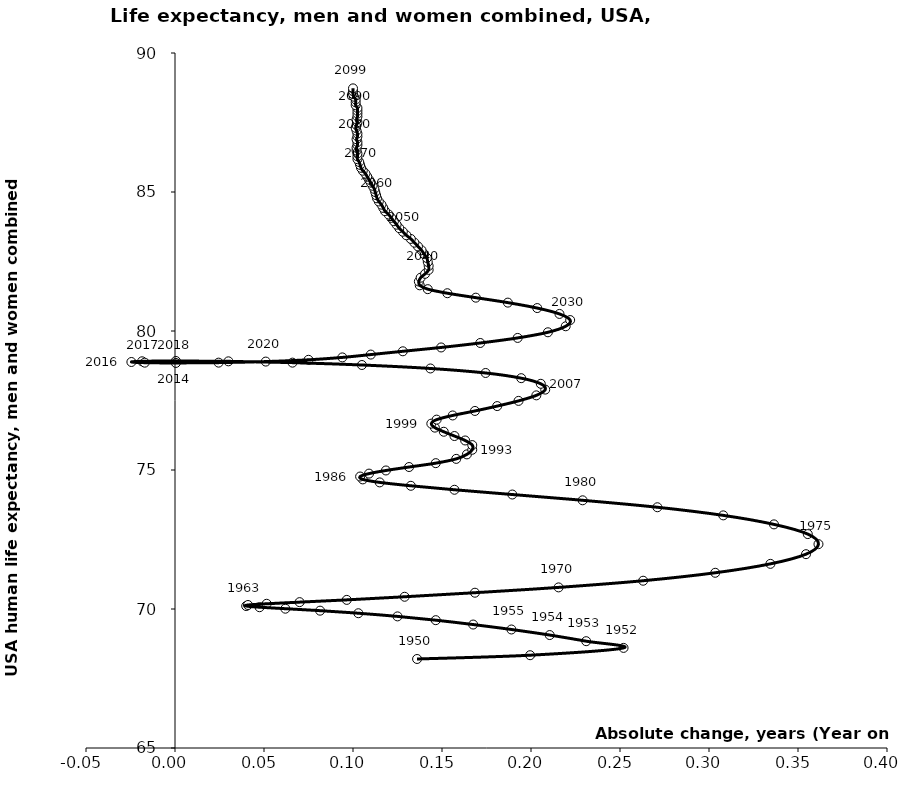
| Category | Series 0 |
|---|---|
| 0.13599999999999568 | 68.202 |
| 0.19950000000000045 | 68.338 |
| 0.25200000000000244 | 68.601 |
| 0.23100000000000165 | 68.842 |
| 0.21050000000000324 | 69.063 |
| 0.18900000000000006 | 69.263 |
| 0.16749999999999687 | 69.441 |
| 0.14649999999999608 | 69.598 |
| 0.125 | 69.734 |
| 0.10300000000000153 | 69.848 |
| 0.08149999999999835 | 69.94 |
| 0.06199999999999761 | 70.011 |
| 0.04749999999999943 | 70.064 |
| 0.04000000000000625 | 70.106 |
| 0.04100000000000392 | 70.144 |
| 0.051499999999997215 | 70.188 |
| 0.07000000000000028 | 70.247 |
| 0.09649999999999892 | 70.328 |
| 0.12899999999999778 | 70.44 |
| 0.16850000000000165 | 70.586 |
| 0.2154999999999987 | 70.777 |
| 0.2629999999999981 | 71.017 |
| 0.30349999999999966 | 71.303 |
| 0.33449999999999847 | 71.624 |
| 0.3545000000000016 | 71.972 |
| 0.3614999999999995 | 72.333 |
| 0.35549999999999926 | 72.695 |
| 0.3365000000000009 | 73.044 |
| 0.30799999999999983 | 73.368 |
| 0.2710000000000008 | 73.66 |
| 0.2289999999999992 | 73.91 |
| 0.18950000000000244 | 74.118 |
| 0.15700000000000358 | 74.289 |
| 0.13250000000000028 | 74.432 |
| 0.11500000000000199 | 74.554 |
| 0.10549999999999926 | 74.662 |
| 0.1039999999999992 | 74.765 |
| 0.10900000000000176 | 74.87 |
| 0.11849999999999739 | 74.983 |
| 0.1314999999999955 | 75.107 |
| 0.14650000000000318 | 75.246 |
| 0.15800000000000125 | 75.4 |
| 0.16399999999999437 | 75.562 |
| 0.1670000000000016 | 75.728 |
| 0.1670000000000016 | 75.896 |
| 0.1629999999999967 | 76.062 |
| 0.15700000000000358 | 76.222 |
| 0.15100000000000335 | 76.376 |
| 0.1460000000000008 | 76.524 |
| 0.14399999999999835 | 76.668 |
| 0.14699999999999847 | 76.812 |
| 0.1559999999999988 | 76.962 |
| 0.16850000000000165 | 77.124 |
| 0.1810000000000045 | 77.299 |
| 0.19299999999999784 | 77.486 |
| 0.20299999999999585 | 77.685 |
| 0.2079999999999984 | 77.892 |
| 0.20550000000000068 | 78.101 |
| 0.1944999999999979 | 78.303 |
| 0.17450000000000188 | 78.49 |
| 0.14350000000000307 | 78.652 |
| 0.10499999999999687 | 78.777 |
| 0.0660000000000025 | 78.862 |
| 0.030000000000001137 | 78.909 |
| 0.000499999999995282 | 78.922 |
| -0.018499999999995964 | 78.91 |
| -0.02449999999999619 | 78.885 |
| -0.017000000000003013 | 78.861 |
| 0.000499999999995282 | 78.851 |
| 0.024500000000003297 | 78.862 |
| 0.05100000000000193 | 78.9 |
| 0.07499999999999574 | 78.964 |
| 0.0940000000000012 | 79.05 |
| 0.10999999999999943 | 79.152 |
| 0.1280000000000001 | 79.27 |
| 0.1495000000000033 | 79.408 |
| 0.17150000000000176 | 79.569 |
| 0.19249999999999545 | 79.751 |
| 0.20949999999999847 | 79.954 |
| 0.21950000000000358 | 80.17 |
| 0.2220000000000013 | 80.393 |
| 0.21600000000000108 | 80.614 |
| 0.20349999999999824 | 80.825 |
| 0.1869999999999976 | 81.021 |
| 0.16899999999999693 | 81.199 |
| 0.1529999999999987 | 81.359 |
| 0.142000000000003 | 81.505 |
| 0.13750000000000284 | 81.643 |
| 0.13700000000000045 | 81.78 |
| 0.13799999999999812 | 81.917 |
| 0.14049999999999585 | 82.056 |
| 0.1424999999999983 | 82.198 |
| 0.1425000000000054 | 82.341 |
| 0.142000000000003 | 82.483 |
| 0.14150000000000063 | 82.625 |
| 0.14000000000000057 | 82.766 |
| 0.1385000000000005 | 82.905 |
| 0.13649999999999807 | 83.043 |
| 0.13449999999999562 | 83.178 |
| 0.13250000000000028 | 83.312 |
| 0.13000000000000256 | 83.443 |
| 0.1280000000000001 | 83.572 |
| 0.12599999999999767 | 83.699 |
| 0.12449999999999761 | 83.824 |
| 0.12299999999999756 | 83.948 |
| 0.1215000000000046 | 84.07 |
| 0.12000000000000455 | 84.191 |
| 0.1180000000000021 | 84.31 |
| 0.11699999999999733 | 84.427 |
| 0.11599999999999966 | 84.544 |
| 0.1144999999999996 | 84.659 |
| 0.11349999999999483 | 84.773 |
| 0.11299999999999955 | 84.886 |
| 0.11250000000000426 | 84.999 |
| 0.11200000000000188 | 85.111 |
| 0.1109999999999971 | 85.223 |
| 0.10999999999999943 | 85.333 |
| 0.10900000000000176 | 85.443 |
| 0.10800000000000409 | 85.551 |
| 0.10699999999999932 | 85.659 |
| 0.10549999999999926 | 85.765 |
| 0.10450000000000159 | 85.87 |
| 0.1039999999999992 | 85.974 |
| 0.10349999999999682 | 86.078 |
| 0.10249999999999915 | 86.181 |
| 0.10249999999999915 | 86.283 |
| 0.10249999999999915 | 86.386 |
| 0.10200000000000387 | 86.488 |
| 0.10199999999999676 | 86.59 |
| 0.10249999999999915 | 86.692 |
| 0.10250000000000625 | 86.795 |
| 0.10199999999999676 | 86.897 |
| 0.10249999999999915 | 86.999 |
| 0.10249999999999915 | 87.102 |
| 0.10199999999999676 | 87.204 |
| 0.10150000000000148 | 87.306 |
| 0.10200000000000387 | 87.407 |
| 0.10249999999999915 | 87.51 |
| 0.10199999999999676 | 87.612 |
| 0.10249999999999915 | 87.714 |
| 0.10249999999999915 | 87.817 |
| 0.10250000000000625 | 87.919 |
| 0.10249999999999915 | 88.022 |
| 0.10149999999999437 | 88.124 |
| 0.10150000000000148 | 88.225 |
| 0.10150000000000148 | 88.327 |
| 0.10050000000000381 | 88.428 |
| 0.10000000000000142 | 88.528 |
| 0.09999999999999432 | 88.628 |
| 0.09999999999999432 | 88.728 |